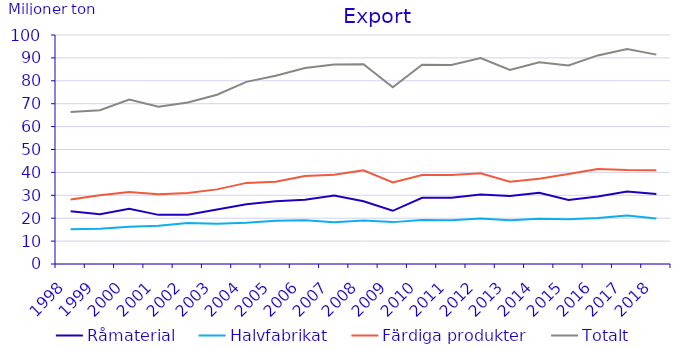
| Category | Råmaterial | Halvfabrikat | Färdiga produkter | Totalt |
|---|---|---|---|---|
| 1998.0 | 23.014 | 15.225 | 28.118 | 66.356 |
| 1999.0 | 21.768 | 15.418 | 29.983 | 67.169 |
| 2000.0 | 24.092 | 16.259 | 31.435 | 71.786 |
| 2001.0 | 21.458 | 16.744 | 30.44 | 68.642 |
| 2002.0 | 21.553 | 17.952 | 30.983 | 70.488 |
| 2003.0 | 23.794 | 17.523 | 32.59 | 73.906 |
| 2004.0 | 26.099 | 18.01 | 35.421 | 79.53 |
| 2005.0 | 27.44 | 18.905 | 35.877 | 82.222 |
| 2006.0 | 28.008 | 19.074 | 38.469 | 85.551 |
| 2007.0 | 29.901 | 18.267 | 38.976 | 87.144 |
| 2008.0 | 27.364 | 18.951 | 40.893 | 87.208 |
| 2009.0 | 23.233 | 18.287 | 35.626 | 77.145 |
| 2010.0 | 28.899 | 19.203 | 38.89 | 86.992 |
| 2011.0 | 28.913 | 19.112 | 38.848 | 86.873 |
| 2012.0 | 30.4 | 19.907 | 39.63 | 89.938 |
| 2013.0 | 29.709 | 19.106 | 35.945 | 84.76 |
| 2014.0 | 31.1 | 19.806 | 37.203 | 88.109 |
| 2015.0 | 27.91 | 19.502 | 39.273 | 86.686 |
| 2016.0 | 29.44 | 20.124 | 41.517 | 91.081 |
| 2017.0 | 31.692 | 21.176 | 41.047 | 93.916 |
| 2018.0 | 30.592 | 19.901 | 40.94 | 91.433 |